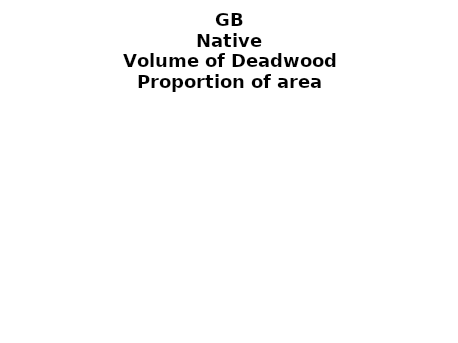
| Category | Native |
|---|---|
|  None | 0.229 |
| >0 and ≤ 10 | 0.125 |
| >10 and ≤ 20  | 0.044 |
| >20 and ≤ 30  | 0.025 |
| >30 and ≤ 40  | 0.016 |
| >40 and ≤ 50  | 0.011 |
| >50 and ≤ 60  | 0.009 |
| >60 and ≤ 70  | 0.007 |
| >70 and ≤ 80  | 0.005 |
| >80 and ≤ 90  | 0.004 |
| >90 and ≤ 100  | 0.003 |
| >100 and ≤ 150 | 0.009 |
| >150 and ≤ 200  | 0.004 |
| >200 and ≤ 500 | 0.004 |
| >500   | 0 |